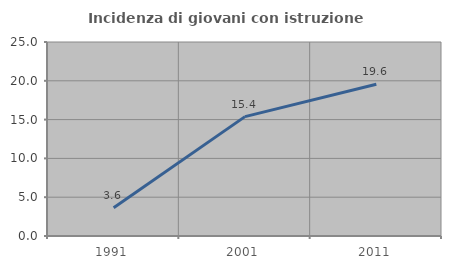
| Category | Incidenza di giovani con istruzione universitaria |
|---|---|
| 1991.0 | 3.636 |
| 2001.0 | 15.385 |
| 2011.0 | 19.565 |